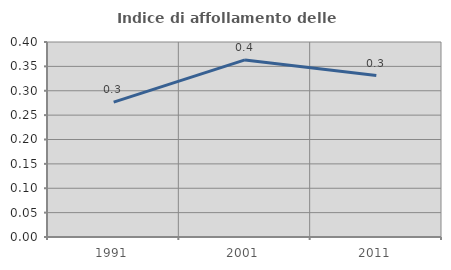
| Category | Indice di affollamento delle abitazioni  |
|---|---|
| 1991.0 | 0.277 |
| 2001.0 | 0.363 |
| 2011.0 | 0.331 |